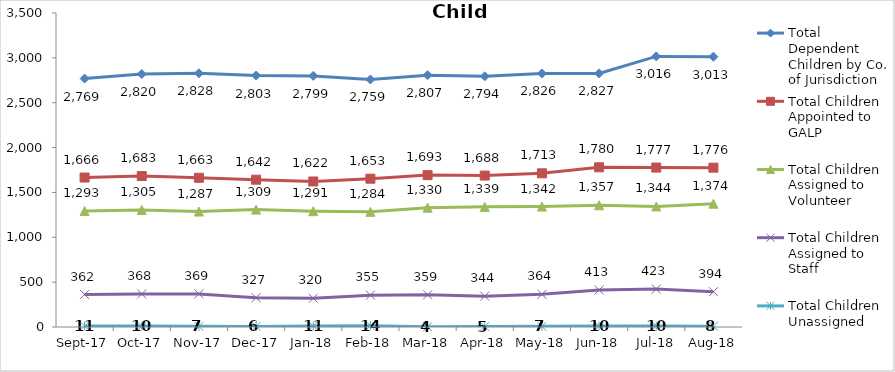
| Category | Total Dependent Children by Co. of Jurisdiction | Total Children Appointed to GALP | Total Children Assigned to Volunteer | Total Children Assigned to Staff | Total Children Unassigned |
|---|---|---|---|---|---|
| 2017-09-01 | 2769 | 1666 | 1293 | 362 | 11 |
| 2017-10-01 | 2820 | 1683 | 1305 | 368 | 10 |
| 2017-11-01 | 2828 | 1663 | 1287 | 369 | 7 |
| 2017-12-01 | 2803 | 1642 | 1309 | 327 | 6 |
| 2018-01-01 | 2799 | 1622 | 1291 | 320 | 11 |
| 2018-02-01 | 2759 | 1653 | 1284 | 355 | 14 |
| 2018-03-01 | 2807 | 1693 | 1330 | 359 | 4 |
| 2018-04-01 | 2794 | 1688 | 1339 | 344 | 5 |
| 2018-05-01 | 2826 | 1713 | 1342 | 364 | 7 |
| 2018-06-01 | 2827 | 1780 | 1357 | 413 | 10 |
| 2018-07-01 | 3016 | 1777 | 1344 | 423 | 10 |
| 2018-08-01 | 3013 | 1776 | 1374 | 394 | 8 |